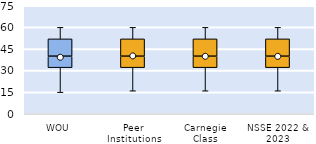
| Category | 25th | 50th | 75th |
|---|---|---|---|
| WOU | 32 | 8 | 12 |
| Peer Institutions | 32 | 8 | 12 |
| Carnegie Class | 32 | 8 | 12 |
| NSSE 2022 & 2023 | 32 | 8 | 12 |